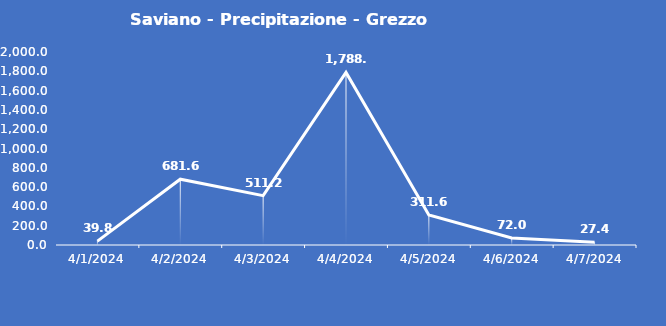
| Category | Saviano - Precipitazione - Grezzo (mm) |
|---|---|
| 4/1/24 | 39.8 |
| 4/2/24 | 681.6 |
| 4/3/24 | 511.2 |
| 4/4/24 | 1788.8 |
| 4/5/24 | 311.6 |
| 4/6/24 | 72 |
| 4/7/24 | 27.4 |